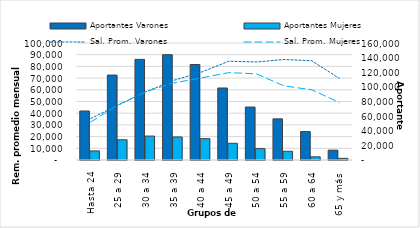
| Category | Aportantes Varones | Aportantes Mujeres |
|---|---|---|
| Hasta 24 | 67010 | 12416 |
| 25 a 29 | 116147 | 27667 |
| 30 a 34 | 137604 | 32719 |
| 35 a 39 | 144027 | 31498 |
| 40 a 44 | 130562 | 29176 |
| 45 a 49 | 98475 | 22855 |
| 50 a 54 | 72473 | 15597 |
| 55 a 59 | 56277 | 11922 |
| 60 a 64 | 38884 | 4335 |
| 65 y más | 13486 | 2288 |